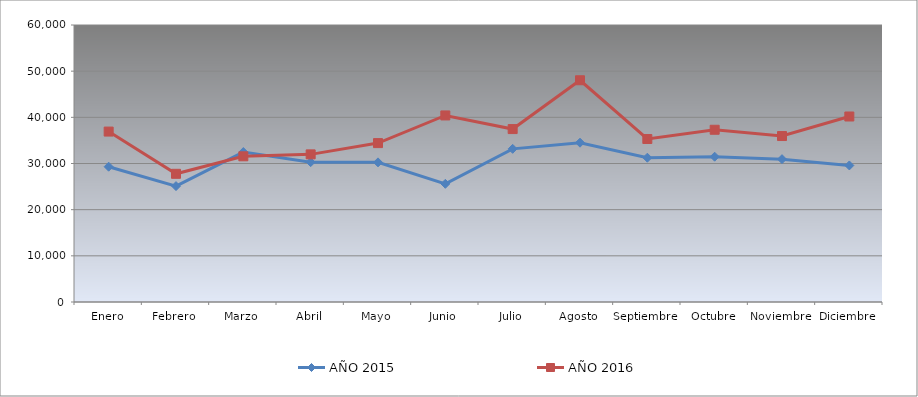
| Category | AÑO 2015 | AÑO 2016 |
|---|---|---|
| Enero | 29307.092 | 36915.484 |
| Febrero | 25104.41 | 27767.156 |
| Marzo | 32478.206 | 31559.383 |
| Abril | 30294.575 | 31978.877 |
| Mayo | 30244.613 | 34418.655 |
| Junio | 25598.152 | 40409.031 |
| Julio | 33174.735 | 37459.149 |
| Agosto | 34506.074 | 48030.401 |
| Septiembre | 31255.608 | 35307.983 |
| Octubre | 31470.15 | 37308.131 |
| Noviembre | 30944.08 | 35948.97 |
| Diciembre | 29577.474 | 40180.827 |